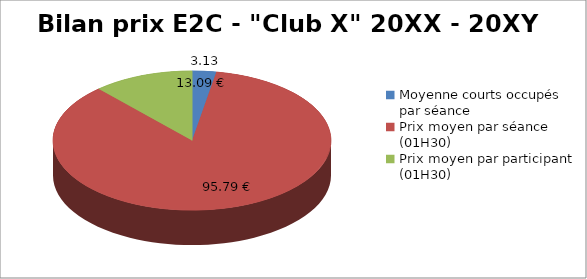
| Category | Bilan prix E2C - "Club X" 20XX - 20XY |
|---|---|
| Moyenne courts occupés par séance | 3.132 |
| Prix moyen par séance (01H30) | 95.789 |
| Prix moyen par participant (01H30) | 13.094 |